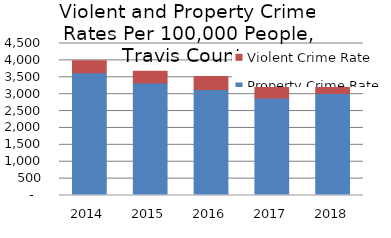
| Category | Property Crime Rate            | Violent Crime Rate |
|---|---|---|
| 2014.0 | 3630.894 | 357.424 |
| 2015.0 | 3329.093 | 347.522 |
| 2016.0 | 3138.737 | 387.428 |
| 2017.0 | 2884.651 | 385.511 |
| 2018.0 | 3022.932 | 371.496 |